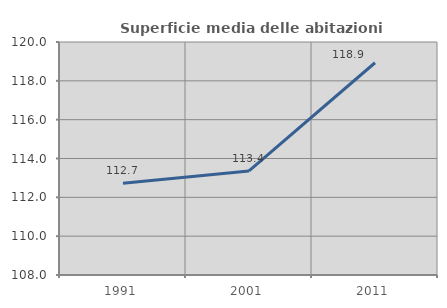
| Category | Superficie media delle abitazioni occupate |
|---|---|
| 1991.0 | 112.727 |
| 2001.0 | 113.361 |
| 2011.0 | 118.931 |